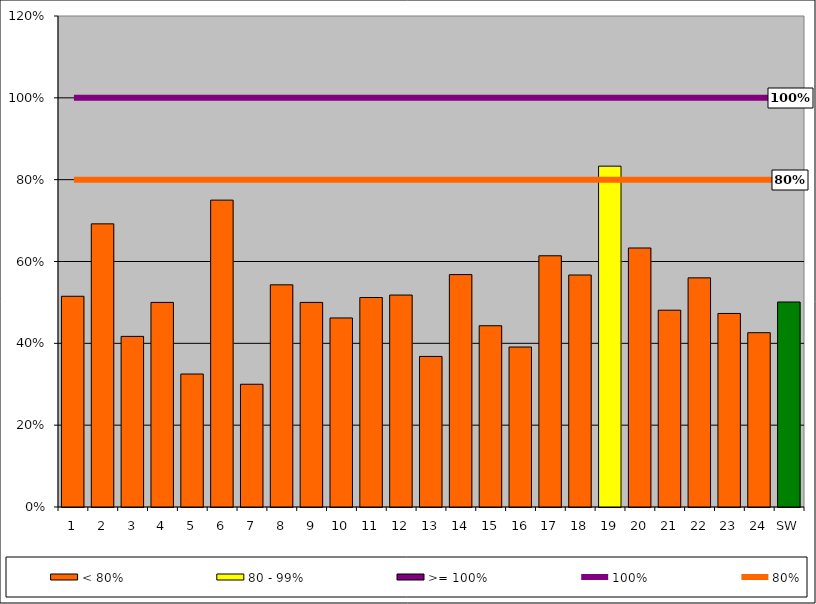
| Category | < 80% | 80 - 99% | >= 100% |
|---|---|---|---|
| 1 | 0.515 | 0 | 0 |
| 2 | 0.692 | 0 | 0 |
| 3 | 0.417 | 0 | 0 |
| 4 | 0.5 | 0 | 0 |
| 5 | 0.325 | 0 | 0 |
| 6 | 0.75 | 0 | 0 |
| 7 | 0.3 | 0 | 0 |
| 8 | 0.543 | 0 | 0 |
| 9 | 0.5 | 0 | 0 |
| 10 | 0.462 | 0 | 0 |
| 11 | 0.512 | 0 | 0 |
| 12 | 0.518 | 0 | 0 |
| 13 | 0.368 | 0 | 0 |
| 14 | 0.568 | 0 | 0 |
| 15 | 0.443 | 0 | 0 |
| 16 | 0.391 | 0 | 0 |
| 17 | 0.614 | 0 | 0 |
| 18 | 0.567 | 0 | 0 |
| 19 | 0 | 0.833 | 0 |
| 20 | 0.633 | 0 | 0 |
| 21 | 0.481 | 0 | 0 |
| 22 | 0.56 | 0 | 0 |
| 23 | 0.473 | 0 | 0 |
| 24 | 0.426 | 0 | 0 |
| SW | 0.501 | 0 | 0 |